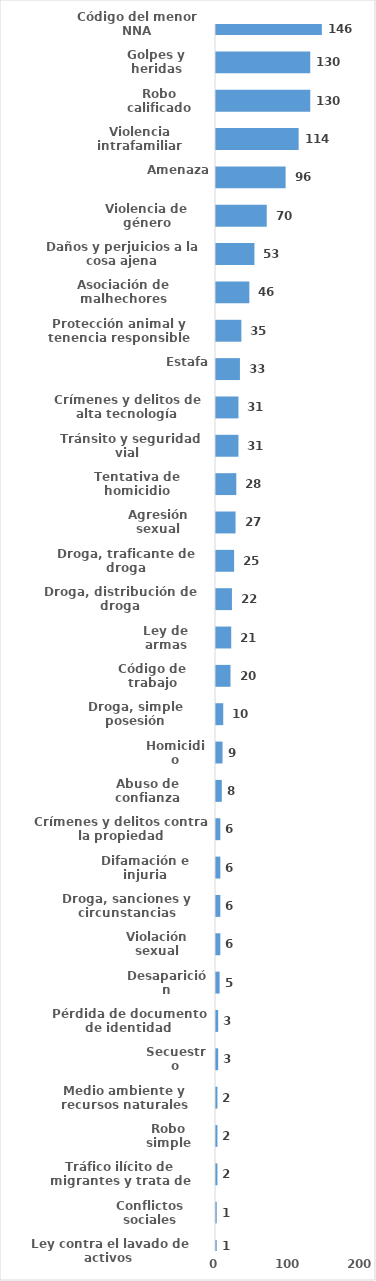
| Category | Series 0 |
|---|---|
| Código del menor NNA | 146 |
| Golpes y heridas | 130 |
| Robo calificado | 130 |
| Violencia intrafamiliar | 114 |
| Amenaza | 96 |
| Violencia de género | 70 |
| Daños y perjuicios a la cosa ajena | 53 |
| Asociación de malhechores | 46 |
| Protección animal y tenencia responsible | 35 |
| Estafa | 33 |
| Crímenes y delitos de alta tecnología | 31 |
| Tránsito y seguridad vial  | 31 |
| Tentativa de homicidio | 28 |
| Agresión sexual | 27 |
| Droga, traficante de droga | 25 |
| Droga, distribución de droga | 22 |
| Ley de armas | 21 |
| Código de trabajo | 20 |
| Droga, simple posesión | 10 |
| Homicidio | 9 |
| Abuso de confianza | 8 |
| Crímenes y delitos contra la propiedad | 6 |
| Difamación e injuria | 6 |
| Droga, sanciones y circunstancias agravantes | 6 |
| Violación sexual | 6 |
| Desaparición | 5 |
| Pérdida de documento de identidad | 3 |
| Secuestro | 3 |
| Medio ambiente y recursos naturales | 2 |
| Robo simple | 2 |
| Tráfico ilícito de migrantes y trata de personas | 2 |
| Conflictos sociales | 1 |
| Ley contra el lavado de activos  | 1 |